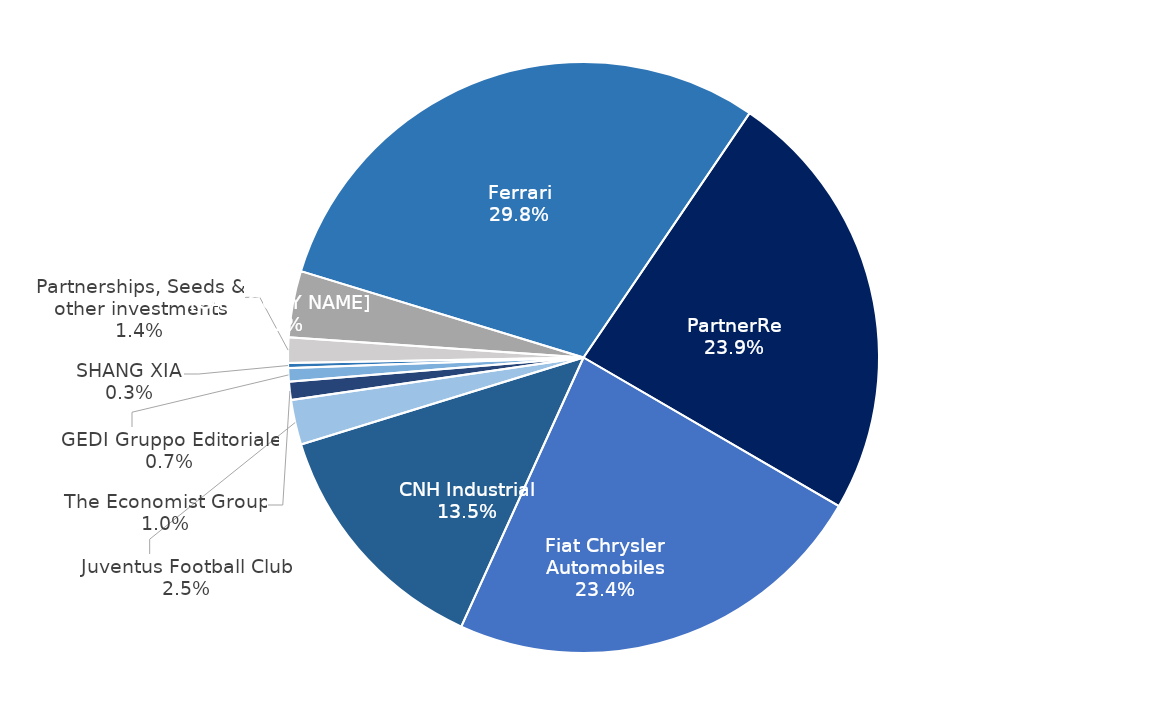
| Category | Series 0 |
|---|---|
| Ferrari | 8383 |
| PartnerRe | 6723 |
| Fiat Chrysler Automobiles | 6588 |
| CNH Industrial | 3789 |
| Juventus Football Club | 691 |
| The Economist Group | 280 |
| GEDI Gruppo Editoriale | 207 |
| SHANG XIA | 78 |
| Partnerships, Seeds & other investments | 389 |
| Others | 1023 |